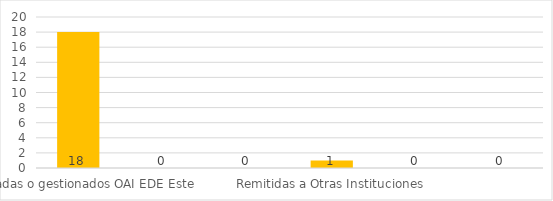
| Category | Series 0 |
|---|---|
| Canalizadas o gestionados OAI EDE Este  | 18 |
| Realizadas a Otras Instituciones | 0 |
| Recibidas de Otras Instituciones  | 0 |
| Remitidas a Otras Instituciones | 1 |
| Desestimada o Rechazada  | 0 |
| Cerradas Incompletas | 0 |